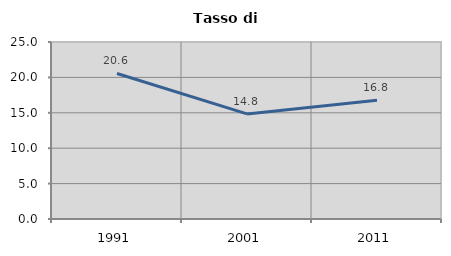
| Category | Tasso di disoccupazione   |
|---|---|
| 1991.0 | 20.556 |
| 2001.0 | 14.844 |
| 2011.0 | 16.779 |